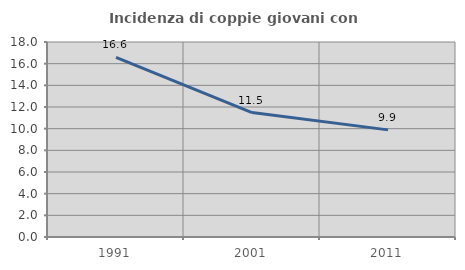
| Category | Incidenza di coppie giovani con figli |
|---|---|
| 1991.0 | 16.571 |
| 2001.0 | 11.491 |
| 2011.0 | 9.887 |